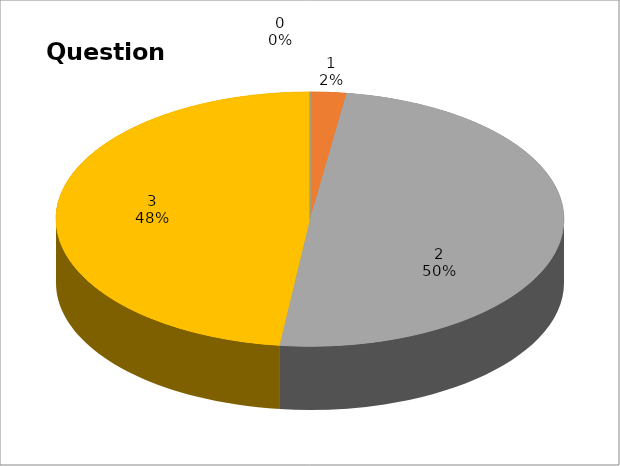
| Category | Series 0 |
|---|---|
| 0 | 0 |
| 1 | 3 |
| 2 | 65 |
| 3 | 63 |